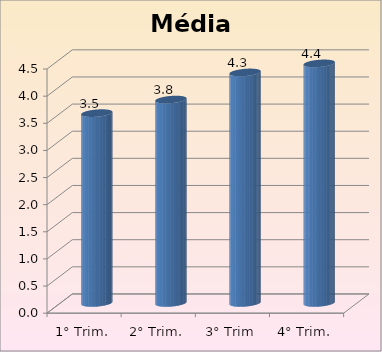
| Category | Média: |
|---|---|
| 1° Trim. | 3.5 |
| 2° Trim. | 3.75 |
| 3° Trim | 4.25 |
| 4° Trim. | 4.417 |